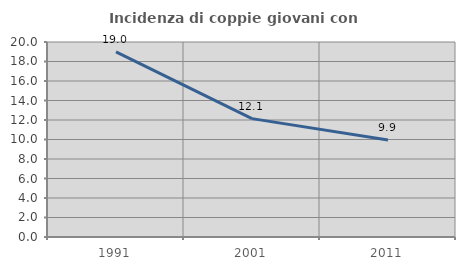
| Category | Incidenza di coppie giovani con figli |
|---|---|
| 1991.0 | 18.983 |
| 2001.0 | 12.14 |
| 2011.0 | 9.946 |